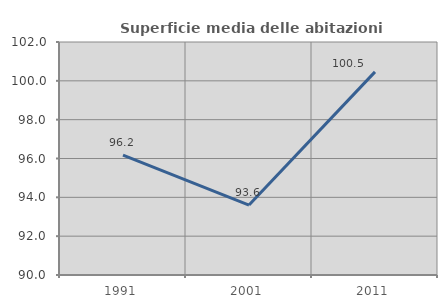
| Category | Superficie media delle abitazioni occupate |
|---|---|
| 1991.0 | 96.173 |
| 2001.0 | 93.601 |
| 2011.0 | 100.461 |